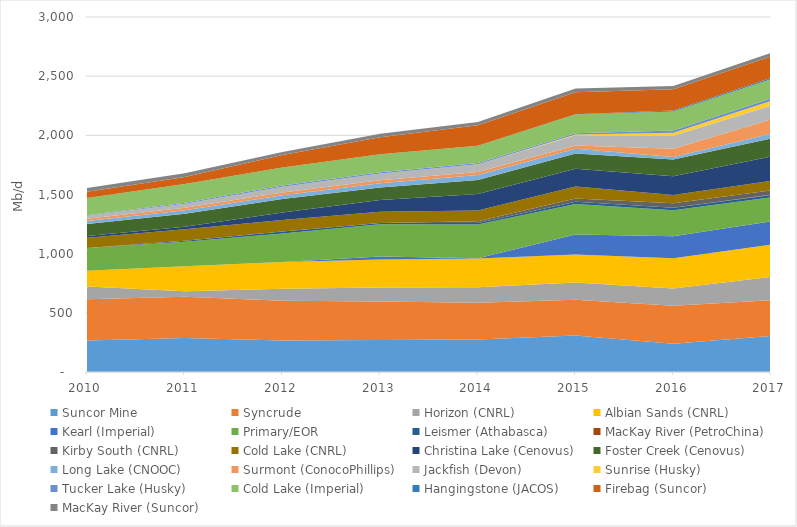
| Category | Suncor Mine | Syncrude | Horizon (CNRL) | Albian Sands (CNRL) | Kearl (Imperial) | Primary/EOR | Leismer (Athabasca) | MacKay River (PetroChina) | Kirby South (CNRL) | Cold Lake (CNRL) | Christina Lake (Cenovus) | Foster Creek (Cenovus) | Long Lake (CNOOC) | Surmont (ConocoPhillips) | Jackfish (Devon) | Sunrise (Husky) | Tucker Lake (Husky) | Cold Lake (Imperial) | Hangingstone (JACOS) | Firebag (Suncor) | MacKay River (Suncor) |
|---|---|---|---|---|---|---|---|---|---|---|---|---|---|---|---|---|---|---|---|---|---|
| 2010.0 | 265.47 | 349.185 | 108.92 | 132.887 | 0 | 190.798 | 0.212 | 0 | 0 | 86.73 | 14.868 | 102.049 | 24.336 | 20.225 | 25.765 | 0 | 4.026 | 144.915 | 0 | 53.57 | 31.485 |
| 2011.0 | 288.121 | 346.915 | 47.847 | 210.121 | 0 | 206.794 | 10.052 | 0 | 0 | 96.248 | 22.404 | 109.73 | 28.453 | 20.888 | 34.524 | 0 | 7.32 | 159.719 | 0 | 59.473 | 30.045 |
| 2012.0 | 266.204 | 335.422 | 102.599 | 225.028 | 0 | 240.87 | 16.329 | 0 | 0 | 98.009 | 62.695 | 115.472 | 31.188 | 22.713 | 49.521 | 0 | 9.551 | 153.59 | 0 | 103.724 | 26.939 |
| 2013.0 | 269.545 | 326.842 | 117.31 | 237.443 | 24.78 | 272.279 | 11.123 | 0 | 0.399 | 94.741 | 98.475 | 106.356 | 36.542 | 25.35 | 57.016 | 0 | 10.318 | 152.61 | 0 | 143.695 | 28.523 |
| 2014.0 | 274.446 | 310.922 | 129.886 | 243.259 | 2.103 | 285.034 | 13.255 | 0 | 15.14 | 91.423 | 138.094 | 118.265 | 42.911 | 24.963 | 65.797 | 0 | 10.83 | 145.893 | 0 | 172.802 | 26.64 |
| 2015.0 | 307.83 | 302.614 | 145.523 | 237.828 | 167.202 | 259.364 | 17.443 | 0 | 29.42 | 99.588 | 149.761 | 130.613 | 38.882 | 27.561 | 86.538 | 6.254 | 11.462 | 158.111 | 1.959 | 186.835 | 30.675 |
| 2016.0 | 238.3 | 320.917 | 146.677 | 255.954 | 185.077 | 220.481 | 20.429 | 0 | 37.674 | 70.706 | 158.811 | 140.268 | 21.713 | 70.062 | 109.534 | 25.821 | 19.085 | 160.776 | 7.386 | 180.603 | 27.65 |
| 2017.0 | 305.248 | 301.83 | 196.756 | 273.583 | 196.151 | 201.289 | 20.764 | 4.171 | 36.089 | 78.64 | 205.526 | 153.287 | 40.776 | 120.148 | 116.555 | 40.155 | 21.908 | 162.612 | 8.939 | 182.12 | 31.021 |